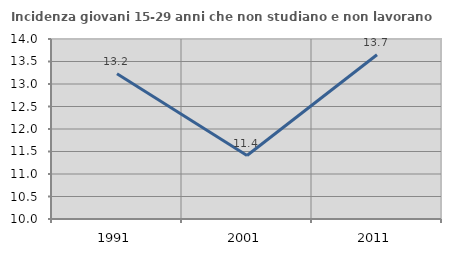
| Category | Incidenza giovani 15-29 anni che non studiano e non lavorano  |
|---|---|
| 1991.0 | 13.229 |
| 2001.0 | 11.41 |
| 2011.0 | 13.651 |